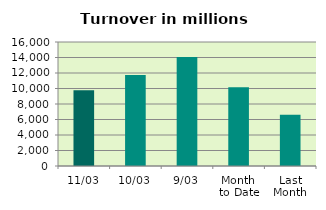
| Category | Series 0 |
|---|---|
| 11/03 | 9777.769 |
| 10/03 | 11744.979 |
| 9/03 | 14072.153 |
| Month 
to Date | 10151.779 |
| Last
Month | 6605.047 |